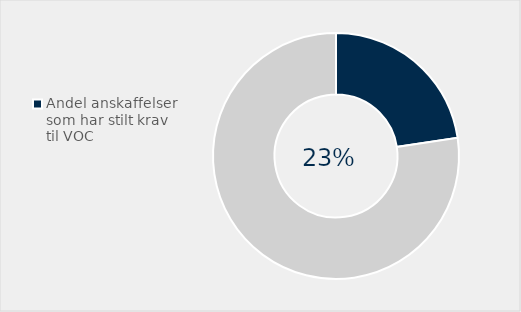
| Category | Series 0 |
|---|---|
| Andel anskaffelser som har stilt krav til VOC | 0.226 |
| Ikke brukt  | 0.774 |